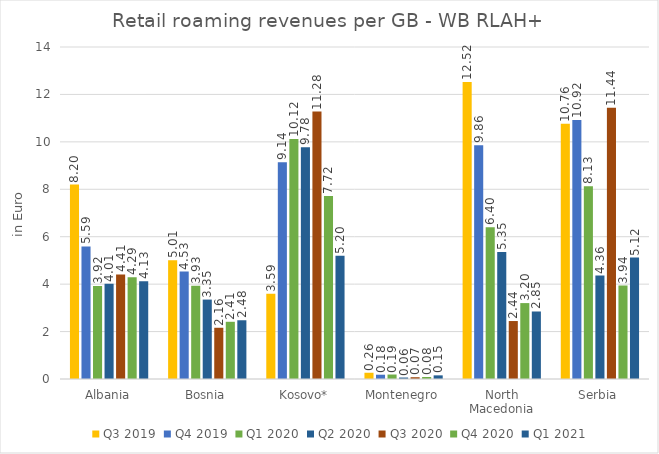
| Category | Q3 2019 | Q4 2019 | Q1 2020 | Q2 2020 | Q3 2020 | Q4 2020 | Q1 2021 |
|---|---|---|---|---|---|---|---|
| Albania | 8.197 | 5.59 | 3.919 | 4.013 | 4.408 | 4.293 | 4.127 |
| Bosnia | 5.008 | 4.531 | 3.931 | 3.349 | 2.16 | 2.413 | 2.477 |
| Kosovo* | 3.594 | 9.142 | 10.121 | 9.775 | 11.278 | 7.718 | 5.197 |
| Montenegro | 0.264 | 0.181 | 0.189 | 0.062 | 0.075 | 0.084 | 0.154 |
| North Macedonia | 12.523 | 9.858 | 6.399 | 5.354 | 2.445 | 3.201 | 2.847 |
| Serbia | 10.762 | 10.919 | 8.126 | 4.362 | 11.438 | 3.941 | 5.12 |